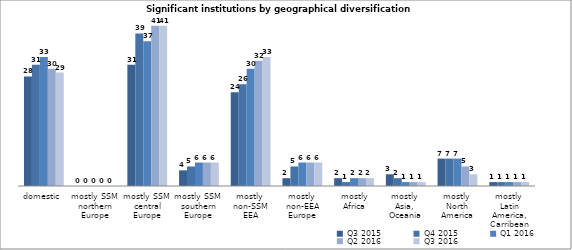
| Category | Q3 2015 | Q4 2015 | Q1 2016 | Q2 2016 | Q3 2016 |
|---|---|---|---|---|---|
| domestic | 28 | 31 | 33 | 30 | 29 |
| mostly SSM 
northern Europe | 0 | 0 | 0 | 0 | 0 |
| mostly SSM 
central Europe | 31 | 39 | 37 | 41 | 41 |
| mostly SSM 
southern Europe | 4 | 5 | 6 | 6 | 6 |
| mostly 
non-SSM EEA | 24 | 26 | 30 | 32 | 33 |
| mostly 
non-EEA Europe | 2 | 5 | 6 | 6 | 6 |
| mostly
Africa | 2 | 1 | 2 | 2 | 2 |
| mostly 
Asia, 
Oceania | 3 | 2 | 1 | 1 | 1 |
| mostly 
North America | 7 | 7 | 7 | 5 | 3 |
| mostly 
Latin America,
Carribean | 1 | 1 | 1 | 1 | 1 |